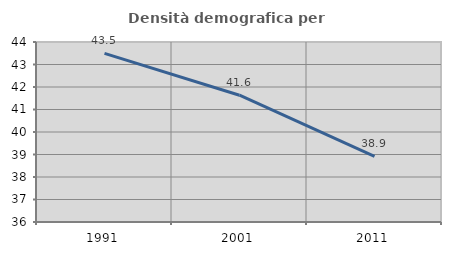
| Category | Densità demografica |
|---|---|
| 1991.0 | 43.495 |
| 2001.0 | 41.635 |
| 2011.0 | 38.917 |